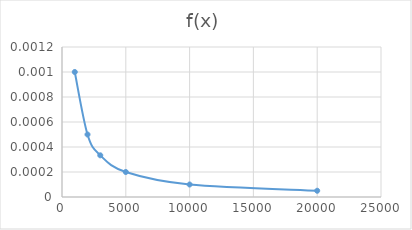
| Category | f(x) |
|---|---|
| 1000.0 | 0.001 |
| 2000.0 | 0 |
| 3000.0 | 0 |
| 5000.0 | 0 |
| 10000.0 | 0 |
| 20000.0 | 0 |